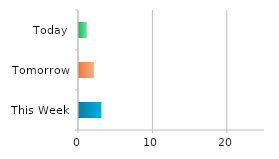
| Category | Series 0 |
|---|---|
| This Week | 3 |
| Tomorrow | 2 |
| Today | 1 |